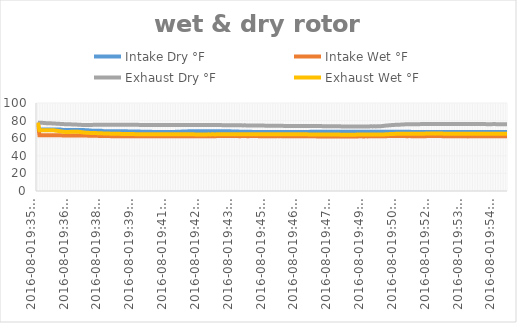
| Category | Intake Dry °F | Intake Wet °F | Exhaust Dry °F | Exhaust Wet °F |
|---|---|---|---|---|
| 2016-08-019:35:35 PM | 69.8 | 77.675 | 77.675 | 77.675 |
| 2016-08-019:35:39 PM | 69.8 | 63.388 | 77.562 | 68.9 |
| 2016-08-019:35:43 PM | 69.8 | 63.388 | 77.45 | 68.9 |
| 2016-08-019:35:47 PM | 69.8 | 63.388 | 77.45 | 69.012 |
| 2016-08-019:35:51 PM | 69.8 | 63.388 | 77.225 | 69.012 |
| 2016-08-019:35:55 PM | 69.8 | 63.388 | 77.112 | 69.012 |
| 2016-08-019:35:59 PM | 69.8 | 63.388 | 77.112 | 69.012 |
| 2016-08-019:36:04 PM | 69.8 | 63.275 | 77 | 69.125 |
| 2016-08-019:36:08 PM | 69.8 | 63.388 | 76.888 | 69.125 |
| 2016-08-019:36:12 PM | 69.8 | 63.275 | 76.775 | 69.012 |
| 2016-08-019:36:16 PM | 69.8 | 63.275 | 76.662 | 68.9 |
| 2016-08-019:36:20 PM | 69.8 | 63.275 | 76.55 | 68.562 |
| 2016-08-019:36:24 PM | 69.8 | 63.275 | 76.438 | 68.338 |
| 2016-08-019:36:29 PM | 69.8 | 63.275 | 76.325 | 68 |
| 2016-08-019:36:33 PM | 69.8 | 63.275 | 76.212 | 67.775 |
| 2016-08-019:36:37 PM | 69.44 | 63.162 | 76.1 | 67.438 |
| 2016-08-019:36:41 PM | 69.44 | 63.162 | 75.988 | 67.212 |
| 2016-08-019:36:45 PM | 69.26 | 63.162 | 75.875 | 67.1 |
| 2016-08-019:36:49 PM | 69.26 | 63.162 | 75.762 | 67.1 |
| 2016-08-019:36:54 PM | 69.26 | 63.162 | 75.762 | 67.1 |
| 2016-08-019:36:58 PM | 69.26 | 63.162 | 75.762 | 67.212 |
| 2016-08-019:37:02 PM | 69.26 | 63.162 | 75.65 | 67.212 |
| 2016-08-019:37:06 PM | 69.26 | 63.162 | 75.538 | 67.325 |
| 2016-08-019:37:10 PM | 69.26 | 63.162 | 75.538 | 67.325 |
| 2016-08-019:37:14 PM | 69.26 | 63.05 | 75.425 | 67.325 |
| 2016-08-019:37:19 PM | 69.26 | 63.05 | 75.312 | 67.212 |
| 2016-08-019:37:23 PM | 69.26 | 63.05 | 75.2 | 66.988 |
| 2016-08-019:37:27 PM | 69.26 | 63.05 | 75.088 | 66.762 |
| 2016-08-019:37:31 PM | 69.26 | 62.938 | 74.975 | 66.538 |
| 2016-08-019:37:35 PM | 69.08 | 62.938 | 74.862 | 66.312 |
| 2016-08-019:37:39 PM | 69.08 | 62.938 | 74.862 | 66.2 |
| 2016-08-019:37:44 PM | 68.9 | 62.825 | 74.975 | 66.088 |
| 2016-08-019:37:48 PM | 68.72 | 62.825 | 75.088 | 65.975 |
| 2016-08-019:37:52 PM | 68.54 | 62.825 | 75.088 | 65.975 |
| 2016-08-019:37:56 PM | 68.54 | 62.712 | 75.2 | 65.862 |
| 2016-08-019:38:00 PM | 68.54 | 62.712 | 75.2 | 65.862 |
| 2016-08-019:38:04 PM | 68.54 | 62.712 | 75.312 | 65.75 |
| 2016-08-019:38:08 PM | 68.36 | 62.6 | 75.2 | 65.638 |
| 2016-08-019:38:13 PM | 68.36 | 62.6 | 75.312 | 65.638 |
| 2016-08-019:38:17 PM | 68.36 | 62.6 | 75.312 | 65.525 |
| 2016-08-019:38:21 PM | 68 | 62.488 | 75.312 | 65.412 |
| 2016-08-019:38:25 PM | 68 | 62.488 | 75.312 | 65.412 |
| 2016-08-019:38:29 PM | 68 | 62.375 | 75.312 | 65.3 |
| 2016-08-019:38:33 PM | 68 | 62.375 | 75.312 | 65.3 |
| 2016-08-019:38:37 PM | 68 | 62.375 | 75.312 | 65.188 |
| 2016-08-019:38:41 PM | 68 | 62.262 | 75.2 | 65.075 |
| 2016-08-019:38:46 PM | 68 | 62.262 | 75.312 | 65.075 |
| 2016-08-019:38:50 PM | 68 | 62.262 | 75.312 | 65.075 |
| 2016-08-019:38:54 PM | 68 | 62.262 | 75.312 | 64.963 |
| 2016-08-019:38:58 PM | 68 | 62.262 | 75.312 | 64.963 |
| 2016-08-019:39:02 PM | 68 | 62.262 | 75.2 | 64.963 |
| 2016-08-019:39:06 PM | 68 | 62.262 | 75.312 | 64.85 |
| 2016-08-019:39:10 PM | 68 | 62.262 | 75.312 | 64.85 |
| 2016-08-019:39:14 PM | 68 | 62.262 | 75.2 | 64.85 |
| 2016-08-019:39:18 PM | 68 | 62.262 | 75.2 | 64.738 |
| 2016-08-019:39:22 PM | 67.64 | 62.262 | 75.2 | 64.738 |
| 2016-08-019:39:26 PM | 67.64 | 62.262 | 75.2 | 64.738 |
| 2016-08-019:39:30 PM | 67.64 | 62.262 | 75.2 | 64.738 |
| 2016-08-019:39:34 PM | 67.64 | 62.262 | 75.2 | 64.738 |
| 2016-08-019:39:38 PM | 67.64 | 62.15 | 75.2 | 64.625 |
| 2016-08-019:39:42 PM | 67.64 | 62.15 | 75.2 | 64.625 |
| 2016-08-019:39:47 PM | 67.64 | 62.15 | 75.2 | 64.625 |
| 2016-08-019:39:51 PM | 67.64 | 62.15 | 75.088 | 64.625 |
| 2016-08-019:39:55 PM | 67.28 | 62.15 | 75.088 | 64.625 |
| 2016-08-019:39:59 PM | 67.28 | 62.15 | 75.088 | 64.625 |
| 2016-08-019:40:03 PM | 67.28 | 62.15 | 75.088 | 64.625 |
| 2016-08-019:40:07 PM | 67.28 | 62.15 | 75.088 | 64.512 |
| 2016-08-019:40:11 PM | 67.28 | 62.15 | 74.975 | 64.512 |
| 2016-08-019:40:15 PM | 67.28 | 62.15 | 75.088 | 64.512 |
| 2016-08-019:40:19 PM | 67.28 | 62.15 | 74.975 | 64.512 |
| 2016-08-019:40:23 PM | 67.1 | 62.15 | 74.975 | 64.512 |
| 2016-08-019:40:27 PM | 66.92 | 62.15 | 74.975 | 64.512 |
| 2016-08-019:40:31 PM | 66.92 | 62.15 | 74.975 | 64.512 |
| 2016-08-019:40:35 PM | 66.92 | 62.15 | 74.975 | 64.512 |
| 2016-08-019:40:39 PM | 66.92 | 62.262 | 74.975 | 64.512 |
| 2016-08-019:40:43 PM | 66.92 | 62.15 | 74.975 | 64.4 |
| 2016-08-019:40:47 PM | 66.92 | 62.15 | 74.975 | 64.4 |
| 2016-08-019:40:51 PM | 66.92 | 62.15 | 74.975 | 64.4 |
| 2016-08-019:40:55 PM | 66.92 | 62.15 | 74.975 | 64.4 |
| 2016-08-019:41:00 PM | 66.92 | 62.262 | 74.862 | 64.4 |
| 2016-08-019:41:04 PM | 66.92 | 62.262 | 74.862 | 64.4 |
| 2016-08-019:41:08 PM | 66.92 | 62.262 | 74.975 | 64.4 |
| 2016-08-019:41:12 PM | 66.92 | 62.262 | 74.862 | 64.512 |
| 2016-08-019:41:16 PM | 66.92 | 62.262 | 74.862 | 64.4 |
| 2016-08-019:41:20 PM | 67.28 | 62.262 | 74.862 | 64.4 |
| 2016-08-019:41:24 PM | 67.28 | 62.262 | 74.862 | 64.4 |
| 2016-08-019:41:28 PM | 67.28 | 62.262 | 74.862 | 64.4 |
| 2016-08-019:41:32 PM | 67.28 | 62.262 | 74.862 | 64.4 |
| 2016-08-019:41:36 PM | 67.64 | 62.262 | 74.862 | 64.4 |
| 2016-08-019:41:40 PM | 67.64 | 62.15 | 74.862 | 64.4 |
| 2016-08-019:41:44 PM | 67.64 | 62.15 | 74.862 | 64.4 |
| 2016-08-019:41:48 PM | 67.64 | 62.15 | 74.862 | 64.4 |
| 2016-08-019:41:52 PM | 68 | 62.15 | 74.862 | 64.4 |
| 2016-08-019:41:56 PM | 68 | 62.15 | 74.862 | 64.4 |
| 2016-08-019:42:00 PM | 68 | 62.15 | 74.862 | 64.4 |
| 2016-08-019:42:04 PM | 68 | 62.15 | 74.862 | 64.4 |
| 2016-08-019:42:08 PM | 68 | 62.15 | 74.862 | 64.287 |
| 2016-08-019:42:12 PM | 68 | 62.15 | 74.862 | 64.287 |
| 2016-08-019:42:16 PM | 68 | 62.15 | 74.862 | 64.287 |
| 2016-08-019:42:20 PM | 68 | 62.15 | 74.862 | 64.287 |
| 2016-08-019:42:24 PM | 68 | 62.15 | 74.862 | 64.287 |
| 2016-08-019:42:28 PM | 68 | 62.15 | 74.862 | 64.287 |
| 2016-08-019:42:33 PM | 68 | 62.15 | 74.862 | 64.287 |
| 2016-08-019:42:37 PM | 68 | 62.262 | 74.862 | 64.287 |
| 2016-08-019:42:41 PM | 68 | 62.262 | 74.862 | 64.4 |
| 2016-08-019:42:45 PM | 68 | 62.262 | 74.862 | 64.287 |
| 2016-08-019:42:49 PM | 68 | 62.262 | 74.862 | 64.4 |
| 2016-08-019:42:53 PM | 68 | 62.262 | 74.862 | 64.4 |
| 2016-08-019:42:57 PM | 68 | 62.262 | 74.862 | 64.287 |
| 2016-08-019:43:01 PM | 68 | 62.375 | 74.862 | 64.4 |
| 2016-08-019:43:05 PM | 68 | 62.375 | 74.862 | 64.4 |
| 2016-08-019:43:09 PM | 68 | 62.375 | 74.862 | 64.4 |
| 2016-08-019:43:13 PM | 68 | 62.375 | 74.862 | 64.4 |
| 2016-08-019:43:17 PM | 68 | 62.375 | 74.75 | 64.4 |
| 2016-08-019:43:21 PM | 68 | 62.375 | 74.75 | 64.4 |
| 2016-08-019:43:25 PM | 68 | 62.375 | 74.75 | 64.512 |
| 2016-08-019:43:29 PM | 68 | 62.375 | 74.75 | 64.512 |
| 2016-08-019:43:33 PM | 68 | 62.375 | 74.75 | 64.512 |
| 2016-08-019:43:38 PM | 67.64 | 62.375 | 74.75 | 64.512 |
| 2016-08-019:43:42 PM | 67.64 | 62.375 | 74.75 | 64.512 |
| 2016-08-019:43:46 PM | 67.64 | 62.375 | 74.75 | 64.512 |
| 2016-08-019:43:50 PM | 67.64 | 62.375 | 74.75 | 64.512 |
| 2016-08-019:43:54 PM | 67.64 | 62.375 | 74.638 | 64.512 |
| 2016-08-019:43:58 PM | 67.28 | 62.262 | 74.638 | 64.512 |
| 2016-08-019:44:03 PM | 67.28 | 62.375 | 74.638 | 64.512 |
| 2016-08-019:44:07 PM | 67.28 | 62.375 | 74.525 | 64.625 |
| 2016-08-019:44:11 PM | 67.28 | 62.375 | 74.638 | 64.512 |
| 2016-08-019:44:15 PM | 67.28 | 62.375 | 74.525 | 64.512 |
| 2016-08-019:44:19 PM | 67.28 | 62.262 | 74.525 | 64.512 |
| 2016-08-019:44:23 PM | 67.28 | 62.375 | 74.525 | 64.625 |
| 2016-08-019:44:28 PM | 67.28 | 62.375 | 74.525 | 64.512 |
| 2016-08-019:44:32 PM | 67.1 | 62.375 | 74.412 | 64.625 |
| 2016-08-019:44:36 PM | 67.1 | 62.375 | 74.412 | 64.625 |
| 2016-08-019:44:40 PM | 66.92 | 62.375 | 74.412 | 64.625 |
| 2016-08-019:44:44 PM | 66.92 | 62.375 | 74.3 | 64.625 |
| 2016-08-019:44:48 PM | 66.92 | 62.262 | 74.3 | 64.512 |
| 2016-08-019:44:53 PM | 66.92 | 62.262 | 74.3 | 64.512 |
| 2016-08-019:44:57 PM | 66.92 | 62.262 | 74.3 | 64.512 |
| 2016-08-019:45:01 PM | 66.92 | 62.262 | 74.3 | 64.512 |
| 2016-08-019:45:05 PM | 66.92 | 62.262 | 74.188 | 64.512 |
| 2016-08-019:45:09 PM | 66.92 | 62.262 | 74.188 | 64.512 |
| 2016-08-019:45:13 PM | 66.92 | 62.262 | 74.188 | 64.512 |
| 2016-08-019:45:18 PM | 66.92 | 62.262 | 74.188 | 64.512 |
| 2016-08-019:45:22 PM | 66.92 | 62.262 | 74.188 | 64.512 |
| 2016-08-019:45:26 PM | 66.92 | 62.262 | 74.075 | 64.512 |
| 2016-08-019:45:30 PM | 66.92 | 62.262 | 74.075 | 64.512 |
| 2016-08-019:45:34 PM | 66.92 | 62.375 | 74.075 | 64.512 |
| 2016-08-019:45:38 PM | 66.92 | 62.262 | 74.075 | 64.512 |
| 2016-08-019:45:43 PM | 66.92 | 62.375 | 74.075 | 64.512 |
| 2016-08-019:45:47 PM | 66.92 | 62.262 | 74.075 | 64.512 |
| 2016-08-019:45:51 PM | 66.92 | 62.262 | 73.962 | 64.512 |
| 2016-08-019:45:55 PM | 66.92 | 62.262 | 73.962 | 64.512 |
| 2016-08-019:45:59 PM | 66.92 | 62.15 | 73.962 | 64.512 |
| 2016-08-019:46:03 PM | 66.92 | 62.262 | 73.962 | 64.4 |
| 2016-08-019:46:07 PM | 66.92 | 62.262 | 73.962 | 64.512 |
| 2016-08-019:46:12 PM | 66.92 | 62.15 | 73.962 | 64.4 |
| 2016-08-019:46:16 PM | 66.92 | 62.262 | 73.962 | 64.4 |
| 2016-08-019:46:20 PM | 66.92 | 62.15 | 73.85 | 64.4 |
| 2016-08-019:46:24 PM | 66.92 | 62.262 | 73.962 | 64.4 |
| 2016-08-019:46:28 PM | 66.92 | 62.15 | 73.962 | 64.4 |
| 2016-08-019:46:32 PM | 66.92 | 62.262 | 73.85 | 64.4 |
| 2016-08-019:46:37 PM | 66.92 | 62.262 | 73.962 | 64.4 |
| 2016-08-019:46:41 PM | 66.92 | 62.262 | 73.962 | 64.4 |
| 2016-08-019:46:45 PM | 66.92 | 62.15 | 73.85 | 64.4 |
| 2016-08-019:46:49 PM | 66.92 | 62.15 | 73.85 | 64.4 |
| 2016-08-019:46:53 PM | 66.92 | 62.15 | 73.85 | 64.287 |
| 2016-08-019:46:57 PM | 67.28 | 62.15 | 73.85 | 64.287 |
| 2016-08-019:47:02 PM | 67.28 | 62.15 | 73.738 | 64.287 |
| 2016-08-019:47:06 PM | 67.28 | 62.15 | 73.85 | 64.287 |
| 2016-08-019:47:10 PM | 67.28 | 62.15 | 73.85 | 64.287 |
| 2016-08-019:47:14 PM | 67.28 | 62.038 | 73.738 | 64.287 |
| 2016-08-019:47:18 PM | 67.28 | 62.038 | 73.738 | 64.287 |
| 2016-08-019:47:22 PM | 67.28 | 62.038 | 73.738 | 64.175 |
| 2016-08-019:47:26 PM | 67.28 | 62.038 | 73.738 | 64.175 |
| 2016-08-019:47:31 PM | 67.28 | 62.038 | 73.625 | 64.175 |
| 2016-08-019:47:35 PM | 67.28 | 62.038 | 73.625 | 64.175 |
| 2016-08-019:47:39 PM | 67.28 | 62.038 | 73.625 | 64.175 |
| 2016-08-019:47:43 PM | 67.28 | 62.038 | 73.625 | 64.175 |
| 2016-08-019:47:47 PM | 67.28 | 62.038 | 73.625 | 64.175 |
| 2016-08-019:47:51 PM | 67.28 | 62.038 | 73.625 | 64.062 |
| 2016-08-019:47:56 PM | 67.28 | 62.038 | 73.512 | 64.175 |
| 2016-08-019:48:00 PM | 67.28 | 62.038 | 73.512 | 64.175 |
| 2016-08-019:48:04 PM | 67.28 | 62.038 | 73.512 | 64.175 |
| 2016-08-019:48:08 PM | 67.28 | 62.038 | 73.512 | 64.175 |
| 2016-08-019:48:12 PM | 67.28 | 62.038 | 73.512 | 64.062 |
| 2016-08-019:48:16 PM | 67.28 | 62.038 | 73.4 | 64.062 |
| 2016-08-019:48:21 PM | 67.28 | 61.925 | 73.4 | 64.062 |
| 2016-08-019:48:25 PM | 67.28 | 61.925 | 73.4 | 64.062 |
| 2016-08-019:48:29 PM | 67.28 | 61.925 | 73.4 | 64.062 |
| 2016-08-019:48:33 PM | 67.28 | 61.925 | 73.4 | 64.062 |
| 2016-08-019:48:37 PM | 67.28 | 61.925 | 73.4 | 64.062 |
| 2016-08-019:48:41 PM | 67.28 | 61.925 | 73.4 | 64.062 |
| 2016-08-019:48:45 PM | 67.28 | 61.925 | 73.4 | 64.062 |
| 2016-08-019:48:50 PM | 67.28 | 62.038 | 73.4 | 64.062 |
| 2016-08-019:48:54 PM | 67.28 | 62.038 | 73.4 | 64.062 |
| 2016-08-019:48:58 PM | 67.28 | 62.038 | 73.4 | 64.175 |
| 2016-08-019:49:02 PM | 67.28 | 62.15 | 73.4 | 64.175 |
| 2016-08-019:49:06 PM | 67.28 | 62.15 | 73.4 | 64.175 |
| 2016-08-019:49:10 PM | 67.28 | 62.038 | 73.4 | 64.175 |
| 2016-08-019:49:15 PM | 67.28 | 62.038 | 73.4 | 64.175 |
| 2016-08-019:49:19 PM | 67.28 | 62.15 | 73.4 | 64.175 |
| 2016-08-019:49:23 PM | 67.28 | 62.038 | 73.4 | 64.175 |
| 2016-08-019:49:27 PM | 67.28 | 62.15 | 73.4 | 64.175 |
| 2016-08-019:49:31 PM | 67.28 | 62.15 | 73.512 | 64.175 |
| 2016-08-019:49:35 PM | 67.28 | 62.15 | 73.4 | 64.175 |
| 2016-08-019:49:39 PM | 67.28 | 62.15 | 73.512 | 64.175 |
| 2016-08-019:49:44 PM | 67.28 | 62.15 | 73.4 | 64.062 |
| 2016-08-019:49:48 PM | 67.28 | 62.15 | 73.512 | 64.175 |
| 2016-08-019:49:52 PM | 67.28 | 62.15 | 73.512 | 64.062 |
| 2016-08-019:49:56 PM | 67.28 | 62.15 | 73.625 | 64.175 |
| 2016-08-019:50:00 PM | 67.28 | 62.15 | 73.85 | 64.175 |
| 2016-08-019:50:04 PM | 67.28 | 62.262 | 74.075 | 64.287 |
| 2016-08-019:50:08 PM | 67.28 | 62.262 | 74.3 | 64.4 |
| 2016-08-019:50:13 PM | 67.28 | 62.375 | 74.412 | 64.512 |
| 2016-08-019:50:17 PM | 67.28 | 62.375 | 74.638 | 64.625 |
| 2016-08-019:50:21 PM | 67.28 | 62.375 | 74.75 | 64.738 |
| 2016-08-019:50:25 PM | 67.28 | 62.375 | 74.975 | 64.738 |
| 2016-08-019:50:29 PM | 67.28 | 62.375 | 75.088 | 64.85 |
| 2016-08-019:50:33 PM | 67.28 | 62.375 | 75.2 | 64.963 |
| 2016-08-019:50:37 PM | 67.28 | 62.375 | 75.312 | 64.963 |
| 2016-08-019:50:42 PM | 67.28 | 62.375 | 75.425 | 64.963 |
| 2016-08-019:50:46 PM | 67.28 | 62.375 | 75.425 | 65.075 |
| 2016-08-019:50:50 PM | 67.28 | 62.375 | 75.538 | 65.075 |
| 2016-08-019:50:54 PM | 67.28 | 62.375 | 75.65 | 65.075 |
| 2016-08-019:50:58 PM | 67.28 | 62.375 | 75.762 | 65.075 |
| 2016-08-019:51:02 PM | 67.28 | 62.262 | 75.762 | 65.188 |
| 2016-08-019:51:07 PM | 67.28 | 62.375 | 75.762 | 65.188 |
| 2016-08-019:51:11 PM | 67.28 | 62.375 | 75.875 | 65.188 |
| 2016-08-019:51:15 PM | 66.92 | 62.262 | 75.875 | 65.188 |
| 2016-08-019:51:19 PM | 66.92 | 62.262 | 75.875 | 65.188 |
| 2016-08-019:51:23 PM | 66.92 | 62.262 | 75.988 | 65.188 |
| 2016-08-019:51:27 PM | 66.92 | 62.262 | 75.988 | 65.188 |
| 2016-08-019:51:31 PM | 66.92 | 62.262 | 75.988 | 65.188 |
| 2016-08-019:51:35 PM | 66.92 | 62.262 | 75.988 | 65.188 |
| 2016-08-019:51:40 PM | 66.92 | 62.262 | 76.1 | 65.188 |
| 2016-08-019:51:44 PM | 66.92 | 62.262 | 76.1 | 65.188 |
| 2016-08-019:51:48 PM | 66.92 | 62.262 | 76.1 | 65.188 |
| 2016-08-019:51:52 PM | 66.92 | 62.375 | 76.1 | 65.3 |
| 2016-08-019:51:56 PM | 66.92 | 62.375 | 76.1 | 65.188 |
| 2016-08-019:52:00 PM | 66.92 | 62.375 | 76.1 | 65.3 |
| 2016-08-019:52:05 PM | 66.92 | 62.375 | 76.1 | 65.3 |
| 2016-08-019:52:09 PM | 66.92 | 62.375 | 76.1 | 65.3 |
| 2016-08-019:52:13 PM | 66.92 | 62.375 | 76.1 | 65.188 |
| 2016-08-019:52:17 PM | 66.92 | 62.375 | 76.212 | 65.3 |
| 2016-08-019:52:21 PM | 66.92 | 62.375 | 76.212 | 65.3 |
| 2016-08-019:52:25 PM | 66.92 | 62.375 | 76.212 | 65.3 |
| 2016-08-019:52:29 PM | 66.92 | 62.375 | 76.1 | 65.3 |
| 2016-08-019:52:33 PM | 66.92 | 62.262 | 76.212 | 65.188 |
| 2016-08-019:52:38 PM | 66.92 | 62.262 | 76.212 | 65.188 |
| 2016-08-019:52:42 PM | 66.92 | 62.262 | 76.212 | 65.188 |
| 2016-08-019:52:46 PM | 66.92 | 62.262 | 76.212 | 65.188 |
| 2016-08-019:52:50 PM | 66.92 | 62.262 | 76.1 | 65.188 |
| 2016-08-019:52:54 PM | 66.92 | 62.262 | 76.212 | 65.188 |
| 2016-08-019:52:58 PM | 66.92 | 62.262 | 76.1 | 65.188 |
| 2016-08-019:53:02 PM | 66.92 | 62.262 | 76.1 | 65.188 |
| 2016-08-019:53:07 PM | 66.92 | 62.15 | 76.1 | 65.188 |
| 2016-08-019:53:11 PM | 66.92 | 62.15 | 76.212 | 65.188 |
| 2016-08-019:53:15 PM | 66.92 | 62.15 | 76.1 | 65.075 |
| 2016-08-019:53:19 PM | 66.92 | 62.15 | 76.1 | 65.075 |
| 2016-08-019:53:23 PM | 66.92 | 62.15 | 76.1 | 65.075 |
| 2016-08-019:53:27 PM | 66.92 | 62.15 | 76.1 | 65.075 |
| 2016-08-019:53:31 PM | 66.92 | 62.15 | 76.1 | 65.075 |
| 2016-08-019:53:36 PM | 66.92 | 62.038 | 76.1 | 65.075 |
| 2016-08-019:53:40 PM | 66.92 | 62.15 | 76.1 | 65.075 |
| 2016-08-019:53:44 PM | 66.92 | 62.15 | 75.988 | 65.075 |
| 2016-08-019:53:48 PM | 66.92 | 62.15 | 76.1 | 65.075 |
| 2016-08-019:53:52 PM | 66.92 | 62.15 | 75.988 | 65.075 |
| 2016-08-019:53:56 PM | 66.92 | 62.15 | 76.1 | 65.075 |
| 2016-08-019:54:01 PM | 66.92 | 62.15 | 76.1 | 65.075 |
| 2016-08-019:54:05 PM | 66.92 | 62.15 | 76.1 | 65.075 |
| 2016-08-019:54:09 PM | 66.92 | 62.15 | 75.988 | 65.075 |
| 2016-08-019:54:13 PM | 66.92 | 62.15 | 76.1 | 65.075 |
| 2016-08-019:54:17 PM | 66.92 | 62.15 | 76.1 | 65.075 |
| 2016-08-019:54:21 PM | 66.92 | 62.15 | 75.988 | 65.075 |
| 2016-08-019:54:26 PM | 66.92 | 62.262 | 75.988 | 65.188 |
| 2016-08-019:54:30 PM | 66.92 | 62.262 | 75.988 | 65.075 |
| 2016-08-019:54:34 PM | 66.92 | 62.15 | 75.988 | 65.188 |
| 2016-08-019:54:38 PM | 66.92 | 62.15 | 75.988 | 65.188 |
| 2016-08-019:54:42 PM | 66.92 | 62.15 | 76.1 | 65.188 |
| 2016-08-019:54:46 PM | 66.92 | 62.15 | 75.988 | 65.188 |
| 2016-08-019:54:50 PM | 66.92 | 62.15 | 75.988 | 65.188 |
| 2016-08-019:54:55 PM | 66.92 | 62.15 | 75.988 | 65.188 |
| 2016-08-019:54:59 PM | 66.92 | 62.15 | 75.988 | 65.188 |
| 2016-08-019:55:03 PM | 66.92 | 62.15 | 75.875 | 65.188 |
| 2016-08-019:55:07 PM | 66.92 | 62.15 | 75.875 | 65.188 |
| 2016-08-019:55:11 PM | 66.92 | 62.15 | 75.988 | 65.188 |
| 2016-08-019:55:15 PM | 66.92 | 62.15 | 75.988 | 65.188 |